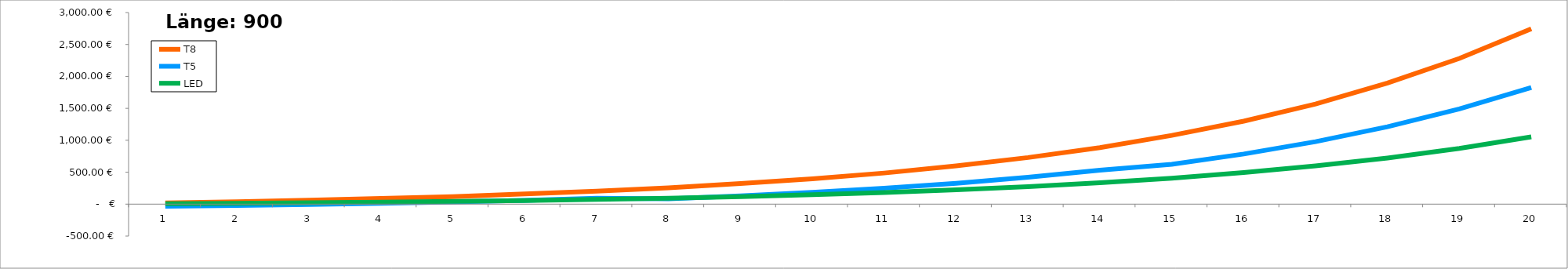
| Category | T8 | T5 | LED |
|---|---|---|---|
| 0 | 19.599 | -33.567 | 5.645 |
| 1 | 37.017 | -20.987 | 12.419 |
| 2 | 63.002 | -5.891 | 20.547 |
| 3 | 88.084 | 12.224 | 30.301 |
| 4 | 118.183 | 33.962 | 42.006 |
| 5 | 159.385 | 60.047 | 56.052 |
| 6 | 202.727 | 91.35 | 72.908 |
| 7 | 254.738 | 84.863 | 93.134 |
| 8 | 322.234 | 129.939 | 117.406 |
| 9 | 397.129 | 184.03 | 146.532 |
| 10 | 487.003 | 248.939 | 181.483 |
| 11 | 599.936 | 326.83 | 223.424 |
| 12 | 729.355 | 420.3 | 273.754 |
| 13 | 884.657 | 532.463 | 334.149 |
| 14 | 1076.104 | 623.008 | 406.624 |
| 15 | 1299.74 | 784.523 | 493.593 |
| 16 | 1568.103 | 978.341 | 597.957 |
| 17 | 1895.222 | 1210.923 | 723.193 |
| 18 | 2281.665 | 1490.02 | 873.476 |
| 19 | 2745.397 | 1824.938 | 1053.816 |